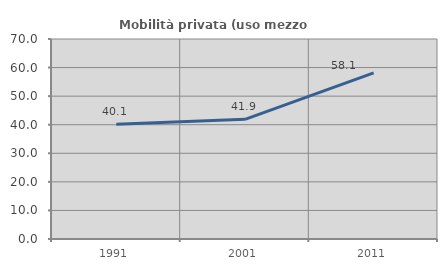
| Category | Mobilità privata (uso mezzo privato) |
|---|---|
| 1991.0 | 40.129 |
| 2001.0 | 41.875 |
| 2011.0 | 58.148 |